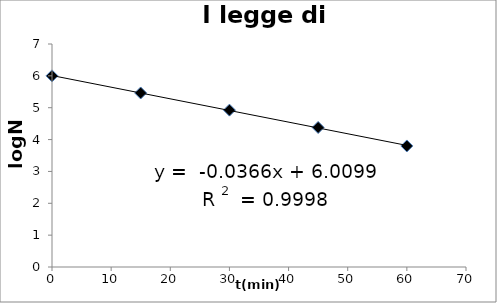
| Category | Series 0 |
|---|---|
| 0.0 | 6 |
| 15.0 | 5.462 |
| 30.0 | 4.924 |
| 45.0 | 4.38 |
| 60.0 | 3.799 |